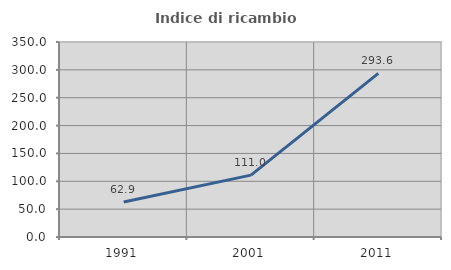
| Category | Indice di ricambio occupazionale  |
|---|---|
| 1991.0 | 62.923 |
| 2001.0 | 111.03 |
| 2011.0 | 293.63 |